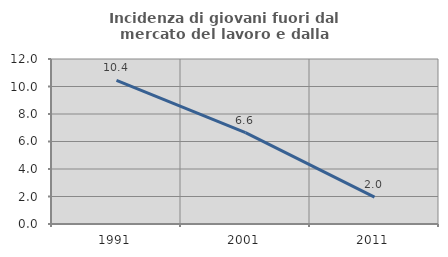
| Category | Incidenza di giovani fuori dal mercato del lavoro e dalla formazione  |
|---|---|
| 1991.0 | 10.45 |
| 2001.0 | 6.643 |
| 2011.0 | 1.958 |